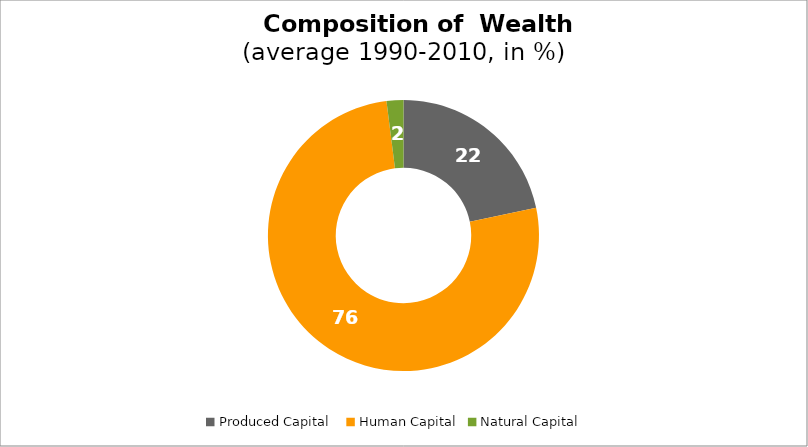
| Category | Series 0 |
|---|---|
| Produced Capital  | 21.718 |
| Human Capital | 76.274 |
| Natural Capital | 2.007 |